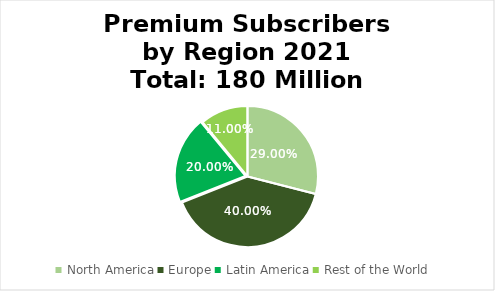
| Category | Series 0 |
|---|---|
| North America | 0.29 |
| Europe | 0.4 |
| Latin America | 0.2 |
| Rest of the World | 0.11 |